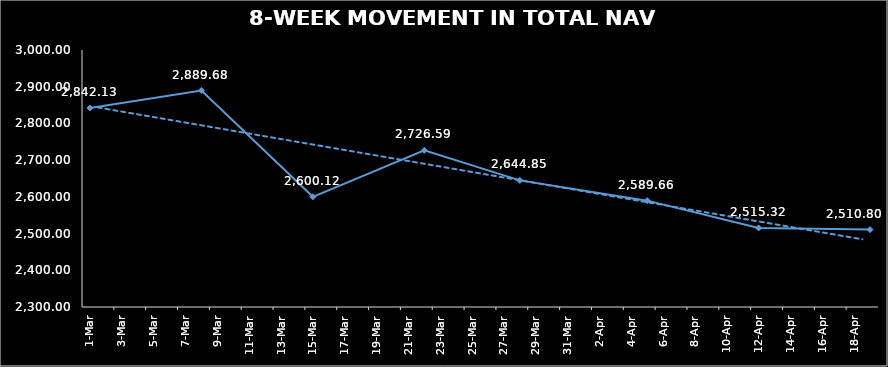
| Category | TOTAL NAV |
|---|---|
| 2024-03-01 | 2842.127 |
| 2024-03-08 | 2889.675 |
| 2024-03-15 | 2600.12 |
| 2024-03-22 | 2726.59 |
| 2024-03-28 | 2644.848 |
| 2024-04-05 | 2589.664 |
| 2024-04-12 | 2515.322 |
| 2024-04-19 | 2510.798 |